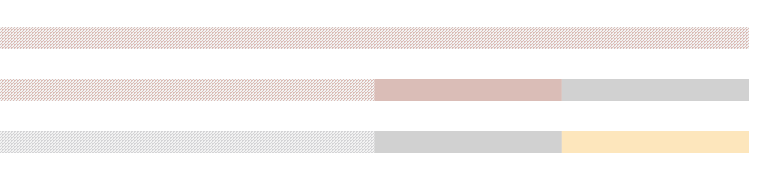
| Category | Bronze | Silver | Gold |
|---|---|---|---|
| 0 | 1 | 0 | 0 |
| 1 | 0.5 | 0.25 | 0.25 |
| 2 | 0.5 | 0.25 | 0.25 |